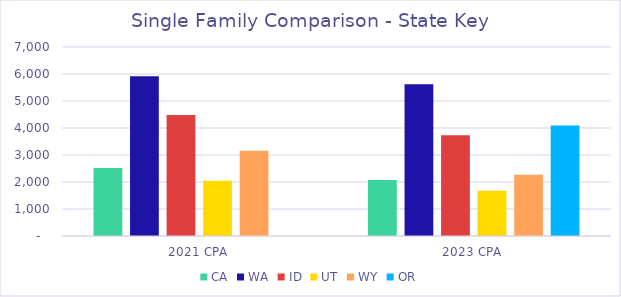
| Category |  CA  |  WA  |  ID  |  UT  |  WY  |  OR  |
|---|---|---|---|---|---|---|
| 2021 CPA | 2518.624 | 5919.839 | 4483.351 | 2043.432 | 3158.543 | 0 |
| 2023 CPA | 2075.888 | 5624.071 | 3729.055 | 1677.529 | 2271.002 | 4095.021 |